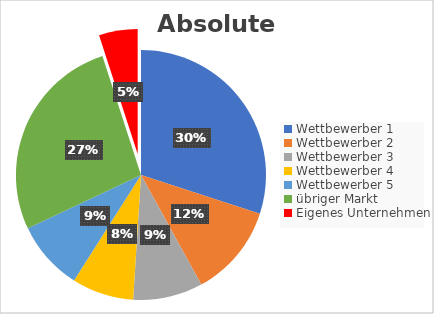
| Category | Series 0 | Series 1 | Series 2 |
|---|---|---|---|
| Wettbewerber 1 | 300 | 4500 | 0.3 |
| Wettbewerber 2 | 120 | 1800 | 0.12 |
| Wettbewerber 3 | 90 | 1350 | 0.09 |
| Wettbewerber 4 | 80 | 1200 | 0.08 |
| Wettbewerber 5 | 90 | 1350 | 0.09 |
| übriger Markt | 270 | 4050 | 0.27 |
| Eigenes Unternehmen | 50 | 750 | 0.05 |